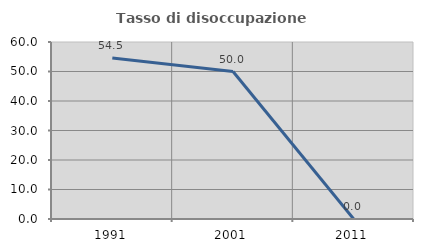
| Category | Tasso di disoccupazione giovanile  |
|---|---|
| 1991.0 | 54.545 |
| 2001.0 | 50 |
| 2011.0 | 0 |